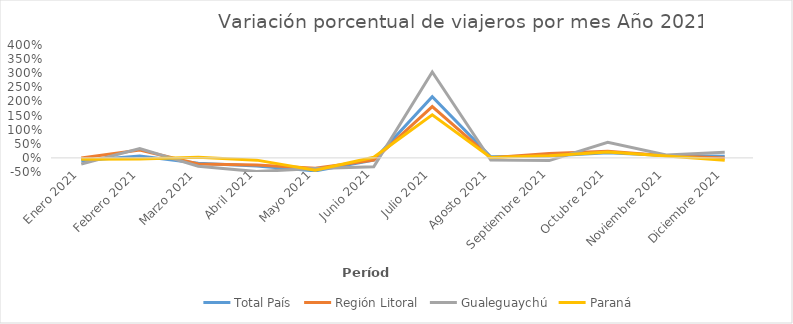
| Category | Total País | Región Litoral | Gualeguaychú | Paraná |
|---|---|---|---|---|
| Enero 2021 | -0.1 | 0 | -0.219 | -0.048 |
| Febrero 2021 | 0.067 | 0.281 | 0.331 | -0.035 |
| Marzo 2021 | -0.187 | -0.217 | -0.296 | 0.022 |
| Abril 2021 | -0.284 | -0.253 | -0.485 | -0.08 |
| Mayo 2021 | -0.461 | -0.363 | -0.374 | -0.438 |
| Junio 2021 | -0.078 | -0.08 | -0.313 | 0.023 |
| Julio 2021 | 2.168 | 1.819 | 3.043 | 1.528 |
| Agosto 2021 | 0.041 | 0.005 | -0.075 | 0.015 |
| Septiembre 2021 | 0.067 | 0.159 | -0.095 | 0.079 |
| Octubre 2021 | 0.18 | 0.235 | 0.554 | 0.211 |
| Noviembre 2021 | 0.089 | 0.072 | 0.102 | 0.068 |
| Diciembre 2021 | 0.055 | -0.004 | 0.204 | -0.08 |